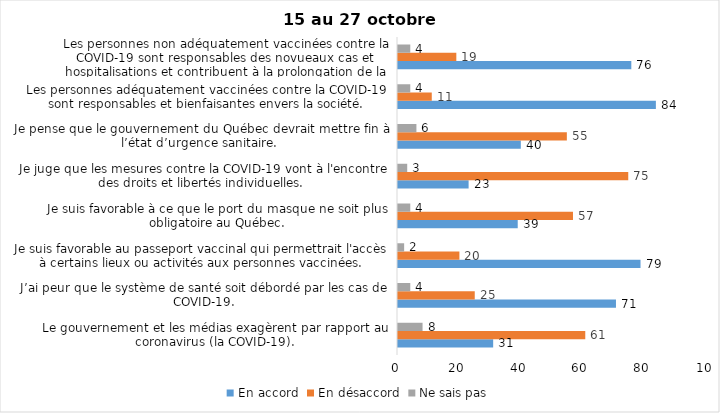
| Category | En accord | En désaccord | Ne sais pas |
|---|---|---|---|
| Le gouvernement et les médias exagèrent par rapport au coronavirus (la COVID-19). | 31 | 61 | 8 |
| J’ai peur que le système de santé soit débordé par les cas de COVID-19. | 71 | 25 | 4 |
| Je suis favorable au passeport vaccinal qui permettrait l'accès à certains lieux ou activités aux personnes vaccinées. | 79 | 20 | 2 |
| Je suis favorable à ce que le port du masque ne soit plus obligatoire au Québec. | 39 | 57 | 4 |
| Je juge que les mesures contre la COVID-19 vont à l'encontre des droits et libertés individuelles.  | 23 | 75 | 3 |
| Je pense que le gouvernement du Québec devrait mettre fin à l’état d’urgence sanitaire.  | 40 | 55 | 6 |
| Les personnes adéquatement vaccinées contre la COVID-19 sont responsables et bienfaisantes envers la société. | 84 | 11 | 4 |
| Les personnes non adéquatement vaccinées contre la COVID-19 sont responsables des novueaux cas et hospitalisations et contribuent à la prolongation de la pandémie au Québec. | 76 | 19 | 4 |